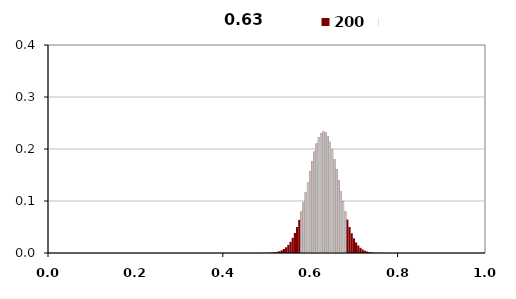
| Category | 200 |
|---|---|
| 0.0 | -1 |
| 0.005 | -1 |
| 0.01 | -1 |
| 0.015 | -1 |
| 0.02 | -1 |
| 0.025 | -1 |
| 0.03 | -1 |
| 0.035 | -1 |
| 0.04 | -1 |
| 0.045 | -1 |
| 0.05 | -1 |
| 0.055 | -1 |
| 0.06 | -1 |
| 0.065 | -1 |
| 0.07 | -1 |
| 0.075 | -1 |
| 0.08 | -1 |
| 0.085 | -1 |
| 0.09 | -1 |
| 0.095 | -1 |
| 0.1 | -1 |
| 0.105 | -1 |
| 0.11 | -1 |
| 0.115 | -1 |
| 0.12 | -1 |
| 0.125 | -1 |
| 0.13 | -1 |
| 0.135 | -1 |
| 0.14 | -1 |
| 0.145 | -1 |
| 0.15 | -1 |
| 0.155 | -1 |
| 0.16 | -1 |
| 0.165 | -1 |
| 0.17 | -1 |
| 0.175 | -1 |
| 0.18 | -1 |
| 0.185 | -1 |
| 0.19 | -1 |
| 0.195 | -1 |
| 0.2 | -1 |
| 0.205 | -1 |
| 0.21 | -1 |
| 0.215 | -1 |
| 0.22 | -1 |
| 0.225 | -1 |
| 0.23 | -1 |
| 0.235 | -1 |
| 0.24 | -1 |
| 0.245 | -1 |
| 0.25 | -1 |
| 0.255 | -1 |
| 0.26 | -1 |
| 0.265 | -1 |
| 0.27 | -1 |
| 0.275 | -1 |
| 0.28 | -1 |
| 0.285 | -1 |
| 0.29 | -1 |
| 0.295 | -1 |
| 0.3 | -1 |
| 0.305 | -1 |
| 0.31 | -1 |
| 0.315 | -1 |
| 0.32 | -1 |
| 0.325 | -1 |
| 0.33 | -1 |
| 0.335 | -1 |
| 0.34 | -1 |
| 0.345 | -1 |
| 0.35 | -1 |
| 0.355 | -1 |
| 0.36 | -1 |
| 0.365 | -1 |
| 0.37 | -1 |
| 0.375 | -1 |
| 0.38 | -1 |
| 0.385 | -1 |
| 0.39 | -1 |
| 0.395 | -1 |
| 0.4 | -1 |
| 0.405 | -1 |
| 0.41 | -1 |
| 0.415 | -1 |
| 0.42 | -1 |
| 0.425 | -1 |
| 0.43 | -1 |
| 0.435 | -1 |
| 0.44 | -1 |
| 0.445 | -1 |
| 0.45 | -1 |
| 0.455 | -1 |
| 0.46 | -1 |
| 0.465 | -1 |
| 0.47 | -1 |
| 0.475 | -1 |
| 0.48 | -1 |
| 0.485 | -1 |
| 0.49 | -1 |
| 0.495 | -1 |
| 0.5 | -1 |
| 0.505 | -1 |
| 0.51 | -1 |
| 0.515 | -1 |
| 0.52 | -1 |
| 0.525 | -1 |
| 0.53 | -1 |
| 0.535 | -1 |
| 0.54 | -1 |
| 0.545 | -1 |
| 0.55 | -1 |
| 0.555 | -1 |
| 0.56 | -1 |
| 0.565 | -1 |
| 0.57 | -1 |
| 0.575 | -1 |
| 0.58 | 0.08 |
| 0.585 | 0.097 |
| 0.59 | 0.116 |
| 0.595 | 0.137 |
| 0.6 | 0.157 |
| 0.605 | 0.177 |
| 0.61 | 0.195 |
| 0.615 | 0.21 |
| 0.62 | 0.222 |
| 0.625 | 0.23 |
| 0.63 | 0.233 |
| 0.635 | 0.232 |
| 0.64 | 0.225 |
| 0.645 | 0.214 |
| 0.65 | 0.199 |
| 0.655 | 0.181 |
| 0.66 | 0.161 |
| 0.665 | 0.14 |
| 0.67 | 0.119 |
| 0.675 | 0.099 |
| 0.68 | 0.081 |
| 0.685 | -1 |
| 0.69 | -1 |
| 0.695 | -1 |
| 0.7 | -1 |
| 0.705 | -1 |
| 0.71 | -1 |
| 0.715 | -1 |
| 0.72 | -1 |
| 0.725 | -1 |
| 0.73 | -1 |
| 0.735 | -1 |
| 0.74 | -1 |
| 0.745 | -1 |
| 0.75 | -1 |
| 0.755 | -1 |
| 0.76 | -1 |
| 0.765 | -1 |
| 0.77 | -1 |
| 0.775 | -1 |
| 0.78 | -1 |
| 0.785 | -1 |
| 0.79 | -1 |
| 0.795 | -1 |
| 0.8 | -1 |
| 0.805 | -1 |
| 0.81 | -1 |
| 0.815 | -1 |
| 0.82 | -1 |
| 0.825 | -1 |
| 0.83 | -1 |
| 0.835 | -1 |
| 0.84 | -1 |
| 0.845 | -1 |
| 0.85 | -1 |
| 0.855 | -1 |
| 0.86 | -1 |
| 0.865 | -1 |
| 0.87 | -1 |
| 0.875 | -1 |
| 0.88 | -1 |
| 0.885 | -1 |
| 0.89 | -1 |
| 0.895 | -1 |
| 0.9 | -1 |
| 0.905 | -1 |
| 0.91 | -1 |
| 0.915 | -1 |
| 0.92 | -1 |
| 0.925 | -1 |
| 0.93 | -1 |
| 0.935 | -1 |
| 0.94 | -1 |
| 0.945 | -1 |
| 0.95 | -1 |
| 0.955 | -1 |
| 0.96 | -1 |
| 0.965 | -1 |
| 0.97 | -1 |
| 0.975 | -1 |
| 0.98 | -1 |
| 0.985 | -1 |
| 0.99 | -1 |
| 0.995 | -1 |
| 1.0 | -1 |